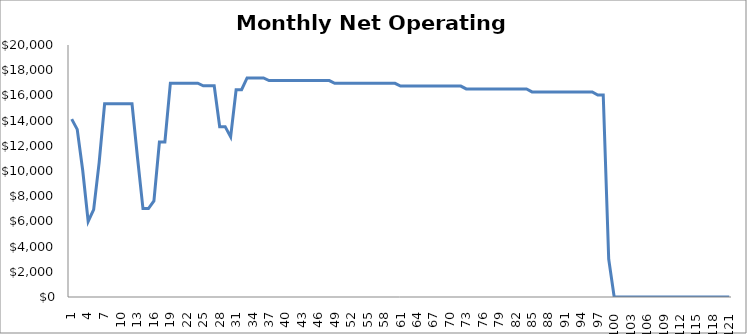
| Category | Series 0 |
|---|---|
| 0 | 14113.961 |
| 1 | 13302.807 |
| 2 | 10058.192 |
| 3 | 6002.422 |
| 4 | 6935.86 |
| 5 | 10669.611 |
| 6 | 15336.801 |
| 7 | 15336.801 |
| 8 | 15336.801 |
| 9 | 15336.801 |
| 10 | 15336.801 |
| 11 | 15336.801 |
| 12 | 11071.232 |
| 13 | 7015.462 |
| 14 | 7015.462 |
| 15 | 7630.225 |
| 16 | 12300.756 |
| 17 | 12300.756 |
| 18 | 16971.288 |
| 19 | 16971.288 |
| 20 | 16971.288 |
| 21 | 16971.288 |
| 22 | 16971.288 |
| 23 | 16971.288 |
| 24 | 16765.523 |
| 25 | 16765.523 |
| 26 | 16765.523 |
| 27 | 13520.908 |
| 28 | 13520.908 |
| 29 | 12709.754 |
| 30 | 16448.933 |
| 31 | 16448.933 |
| 32 | 17383.728 |
| 33 | 17383.728 |
| 34 | 17383.728 |
| 35 | 17383.728 |
| 36 | 17175.336 |
| 37 | 17175.336 |
| 38 | 17175.336 |
| 39 | 17175.336 |
| 40 | 17175.336 |
| 41 | 17175.336 |
| 42 | 17175.336 |
| 43 | 17175.336 |
| 44 | 17175.336 |
| 45 | 17175.336 |
| 46 | 17175.336 |
| 47 | 17175.336 |
| 48 | 16960.693 |
| 49 | 16960.693 |
| 50 | 16960.693 |
| 51 | 16960.693 |
| 52 | 16960.693 |
| 53 | 16960.693 |
| 54 | 16960.693 |
| 55 | 16960.693 |
| 56 | 16960.693 |
| 57 | 16960.693 |
| 58 | 16960.693 |
| 59 | 16960.693 |
| 60 | 16739.61 |
| 61 | 16739.61 |
| 62 | 16739.61 |
| 63 | 16739.61 |
| 64 | 16739.61 |
| 65 | 16739.61 |
| 66 | 16739.61 |
| 67 | 16739.61 |
| 68 | 16739.61 |
| 69 | 16739.61 |
| 70 | 16739.61 |
| 71 | 16739.61 |
| 72 | 16511.894 |
| 73 | 16511.894 |
| 74 | 16511.894 |
| 75 | 16511.894 |
| 76 | 16511.894 |
| 77 | 16511.894 |
| 78 | 16511.894 |
| 79 | 16511.894 |
| 80 | 16511.894 |
| 81 | 16511.894 |
| 82 | 16511.894 |
| 83 | 16511.894 |
| 84 | 16277.347 |
| 85 | 16277.347 |
| 86 | 16277.347 |
| 87 | 16277.347 |
| 88 | 16277.347 |
| 89 | 16277.347 |
| 90 | 16277.347 |
| 91 | 16277.347 |
| 92 | 16277.347 |
| 93 | 16277.347 |
| 94 | 16277.347 |
| 95 | 16277.347 |
| 96 | 16035.764 |
| 97 | 16035.764 |
| 98 | 3000 |
| 99 | 0 |
| 100 | 0 |
| 101 | 0 |
| 102 | 0 |
| 103 | 0 |
| 104 | 0 |
| 105 | 0 |
| 106 | 0 |
| 107 | 0 |
| 108 | 0 |
| 109 | 0 |
| 110 | 0 |
| 111 | 0 |
| 112 | 0 |
| 113 | 0 |
| 114 | 0 |
| 115 | 0 |
| 116 | 0 |
| 117 | 0 |
| 118 | 0 |
| 119 | 0 |
| 120 | 0 |